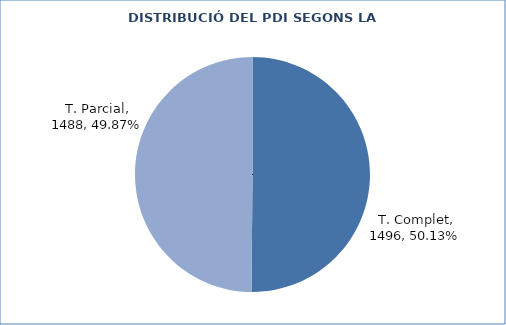
| Category | Series 0 |
|---|---|
| T. Complet | 1496 |
| T. Parcial | 1488 |